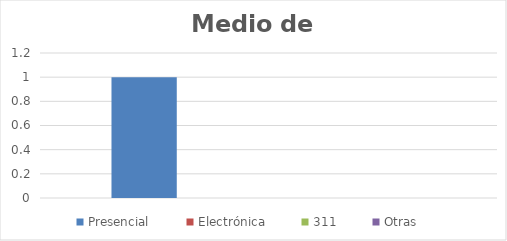
| Category | Presencial | Electrónica | 311 | Otras |
|---|---|---|---|---|
| 0 | 1 | 0 | 0 | 0 |